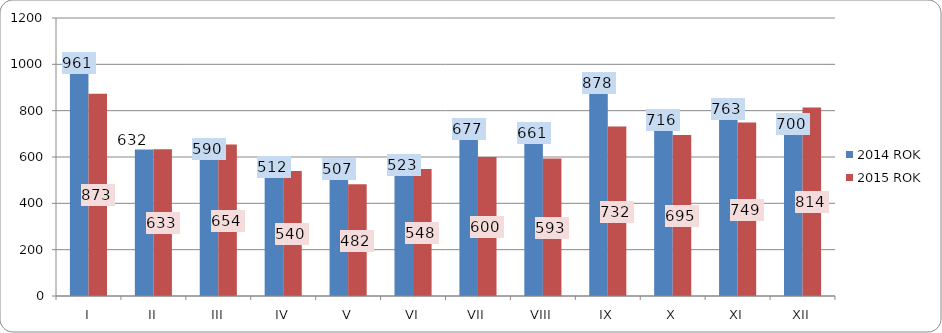
| Category | 2014 ROK | 2015 ROK |
|---|---|---|
| I | 961 | 873 |
| II | 632 | 633 |
| III | 590 | 654 |
| IV | 512 | 540 |
| V | 507 | 482 |
| VI | 523 | 548 |
| VII | 677 | 600 |
| VIII | 661 | 593 |
| IX | 878 | 732 |
| X | 716 | 695 |
| XI | 763 | 749 |
| XII | 700 | 814 |